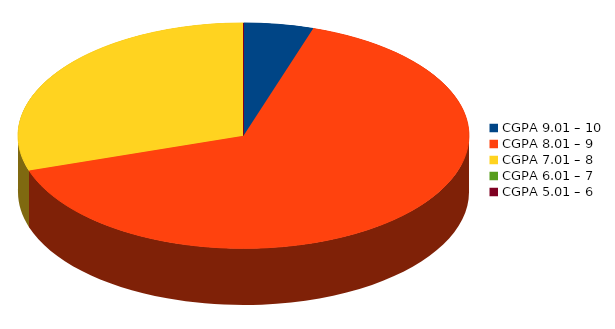
| Category | Number of students |
|---|---|
| CGPA 9.01 – 10 | 2 |
| CGPA 8.01 – 9 | 26 |
| CGPA 7.01 – 8 | 12 |
| CGPA 6.01 – 7 | 0 |
| CGPA 5.01 – 6 | 0 |